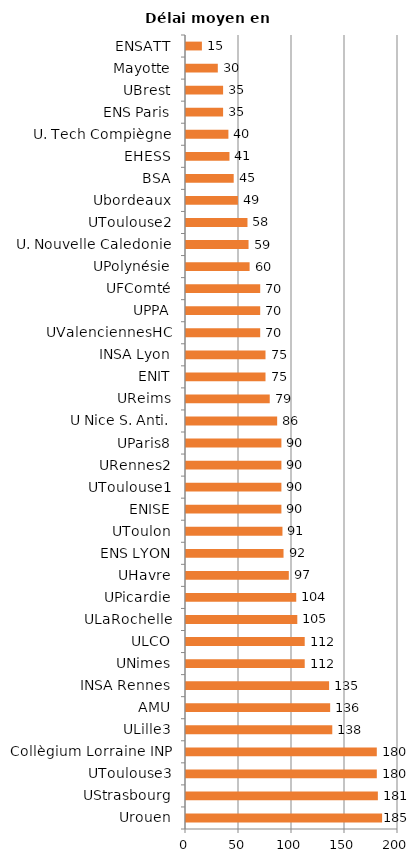
| Category | Délai moyen en jours |
|---|---|
| Urouen | 185 |
| UStrasbourg | 181 |
| UToulouse3 | 180 |
| Collègium Lorraine INP | 180 |
| ULille3 | 138 |
| AMU | 136 |
| INSA Rennes | 135 |
| UNimes | 112 |
| ULCO | 112 |
| ULaRochelle | 105 |
| UPicardie | 104 |
| UHavre | 97 |
| ENS LYON | 92 |
| UToulon | 91 |
| ENISE | 90 |
| UToulouse1 | 90 |
| URennes2 | 90 |
| UParis8 | 90 |
| U Nice S. Anti. | 86 |
| UReims | 79 |
| ENIT | 75 |
| INSA Lyon | 75 |
| UValenciennesHC | 70 |
| UPPA | 70 |
| UFComté | 70 |
| UPolynésie | 60 |
| U. Nouvelle Caledonie | 59 |
| UToulouse2 | 58 |
| Ubordeaux | 49 |
| BSA | 45 |
| EHESS | 41 |
| U. Tech Compiègne | 40 |
| ENS Paris | 35 |
| UBrest | 35 |
| Mayotte | 30 |
| ENSATT | 15 |